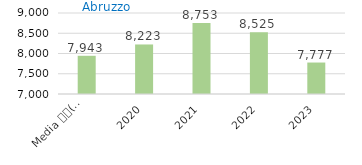
| Category | Series 0 |
|---|---|
| Media 
(2015-2019) | 7943.4 |
| 2020 | 8223 |
| 2021 | 8753 |
| 2022 | 8525 |
| 2023 | 7776.87 |